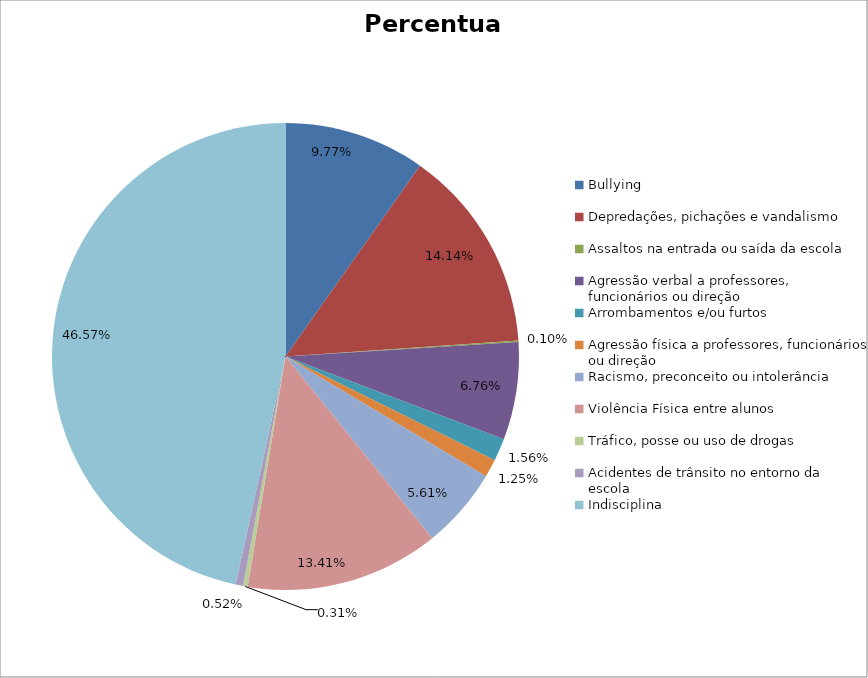
| Category | Percentual |
|---|---|
| Bullying | 0.098 |
| Depredações, pichações e vandalismo | 0.141 |
| Assaltos na entrada ou saída da escola | 0.001 |
| Agressão verbal a professores, funcionários ou direção | 0.068 |
| Arrombamentos e/ou furtos | 0.016 |
| Agressão física a professores, funcionários ou direção | 0.012 |
| Racismo, preconceito ou intolerância | 0.056 |
| Violência Física entre alunos | 0.134 |
| Tráfico, posse ou uso de drogas | 0.003 |
| Acidentes de trânsito no entorno da escola | 0.005 |
| Indisciplina | 0.466 |